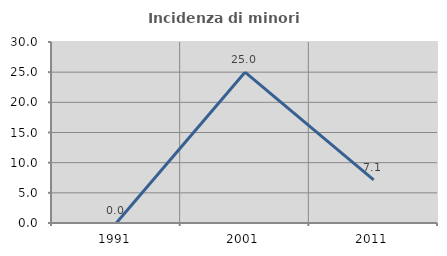
| Category | Incidenza di minori stranieri |
|---|---|
| 1991.0 | 0 |
| 2001.0 | 25 |
| 2011.0 | 7.143 |